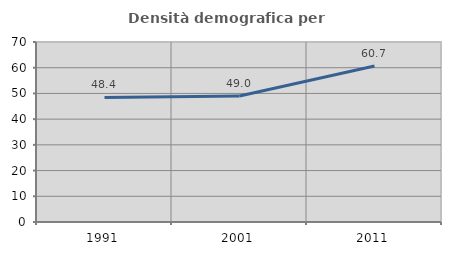
| Category | Densità demografica |
|---|---|
| 1991.0 | 48.444 |
| 2001.0 | 49.032 |
| 2011.0 | 60.673 |